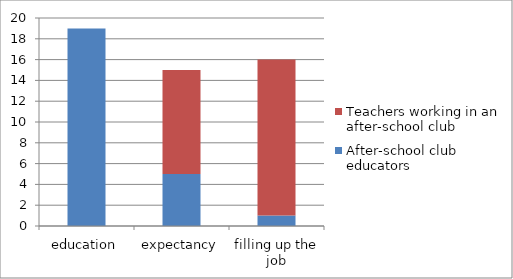
| Category | After-school club educators | Teachers working in an after-school club |
|---|---|---|
| education | 19 | 0 |
| expectancy | 5 | 10 |
| filling up the job | 1 | 15 |